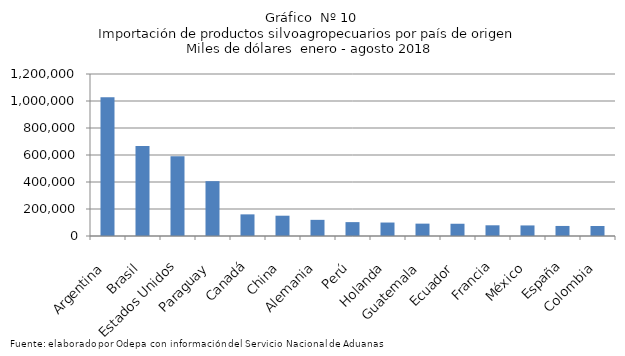
| Category | Series 0 |
|---|---|
| Argentina | 1027753.388 |
| Brasil | 667339.034 |
| Estados Unidos | 590397.529 |
| Paraguay | 406321.47 |
| Canadá | 160256.174 |
| China | 150332.791 |
| Alemania | 119627.97 |
| Perú | 102802.862 |
| Holanda | 99781.695 |
| Guatemala | 91602.507 |
| Ecuador | 90735.209 |
| Francia | 79311.483 |
| México | 78267.336 |
| España | 74428.773 |
| Colombia | 74104.644 |